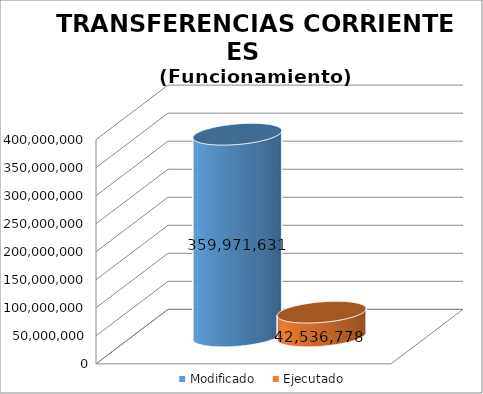
| Category | Modificado | Ejecutado |
|---|---|---|
| 0 | 359971631 | 42536778.21 |